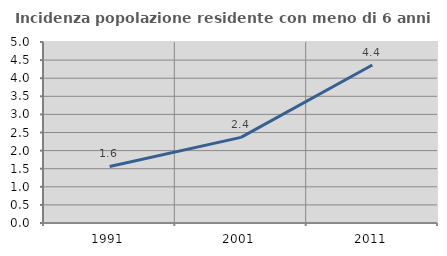
| Category | Incidenza popolazione residente con meno di 6 anni |
|---|---|
| 1991.0 | 1.562 |
| 2001.0 | 2.365 |
| 2011.0 | 4.365 |